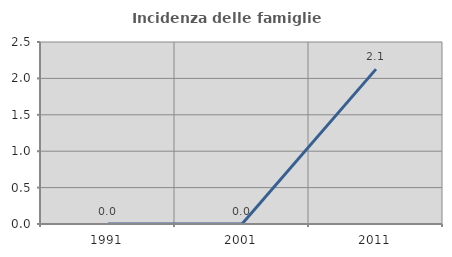
| Category | Incidenza delle famiglie numerose |
|---|---|
| 1991.0 | 0 |
| 2001.0 | 0 |
| 2011.0 | 2.128 |